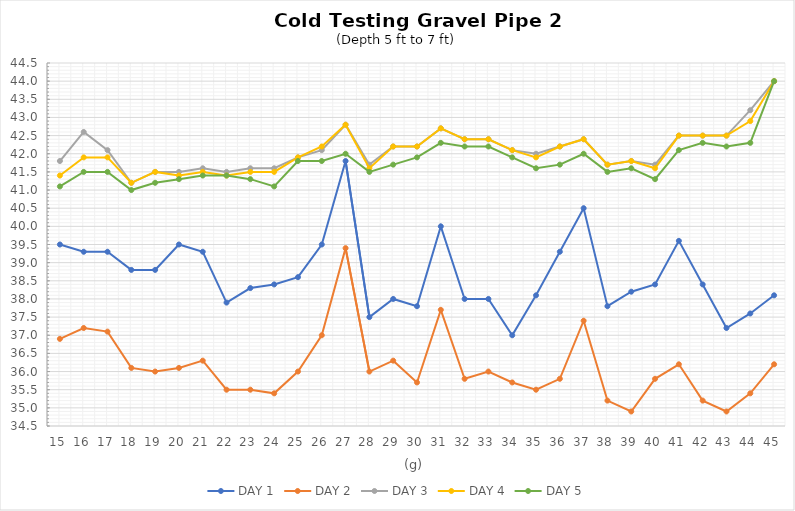
| Category | DAY 1 | DAY 2 | DAY 3 | DAY 4 | DAY 5 |
|---|---|---|---|---|---|
| 15.0 | 39.5 | 36.9 | 41.8 | 41.4 | 41.1 |
| 16.0 | 39.3 | 37.2 | 42.6 | 41.9 | 41.5 |
| 17.0 | 39.3 | 37.1 | 42.1 | 41.9 | 41.5 |
| 18.0 | 38.8 | 36.1 | 41.2 | 41.2 | 41 |
| 19.0 | 38.8 | 36 | 41.5 | 41.5 | 41.2 |
| 20.0 | 39.5 | 36.1 | 41.5 | 41.4 | 41.3 |
| 21.0 | 39.3 | 36.3 | 41.6 | 41.5 | 41.4 |
| 22.0 | 37.9 | 35.5 | 41.5 | 41.4 | 41.4 |
| 23.0 | 38.3 | 35.5 | 41.6 | 41.5 | 41.3 |
| 24.0 | 38.4 | 35.4 | 41.6 | 41.5 | 41.1 |
| 25.0 | 38.6 | 36 | 41.9 | 41.9 | 41.8 |
| 26.0 | 39.5 | 37 | 42.1 | 42.2 | 41.8 |
| 27.0 | 41.8 | 39.4 | 42.8 | 42.8 | 42 |
| 28.0 | 37.5 | 36 | 41.7 | 41.6 | 41.5 |
| 29.0 | 38 | 36.3 | 42.2 | 42.2 | 41.7 |
| 30.0 | 37.8 | 35.7 | 42.2 | 42.2 | 41.9 |
| 31.0 | 40 | 37.7 | 42.7 | 42.7 | 42.3 |
| 32.0 | 38 | 35.8 | 42.4 | 42.4 | 42.2 |
| 33.0 | 38 | 36 | 42.4 | 42.4 | 42.2 |
| 34.0 | 37 | 35.7 | 42.1 | 42.1 | 41.9 |
| 35.0 | 38.1 | 35.5 | 42 | 41.9 | 41.6 |
| 36.0 | 39.3 | 35.8 | 42.2 | 42.2 | 41.7 |
| 37.0 | 40.5 | 37.4 | 42.4 | 42.4 | 42 |
| 38.0 | 37.8 | 35.2 | 41.7 | 41.7 | 41.5 |
| 39.0 | 38.2 | 34.9 | 41.8 | 41.8 | 41.6 |
| 40.0 | 38.4 | 35.8 | 41.7 | 41.6 | 41.3 |
| 41.0 | 39.6 | 36.2 | 42.5 | 42.5 | 42.1 |
| 42.0 | 38.4 | 35.2 | 42.5 | 42.5 | 42.3 |
| 43.0 | 37.2 | 34.9 | 42.5 | 42.5 | 42.2 |
| 44.0 | 37.6 | 35.4 | 43.2 | 42.9 | 42.3 |
| 45.0 | 38.1 | 36.2 | 44 | 44 | 44 |